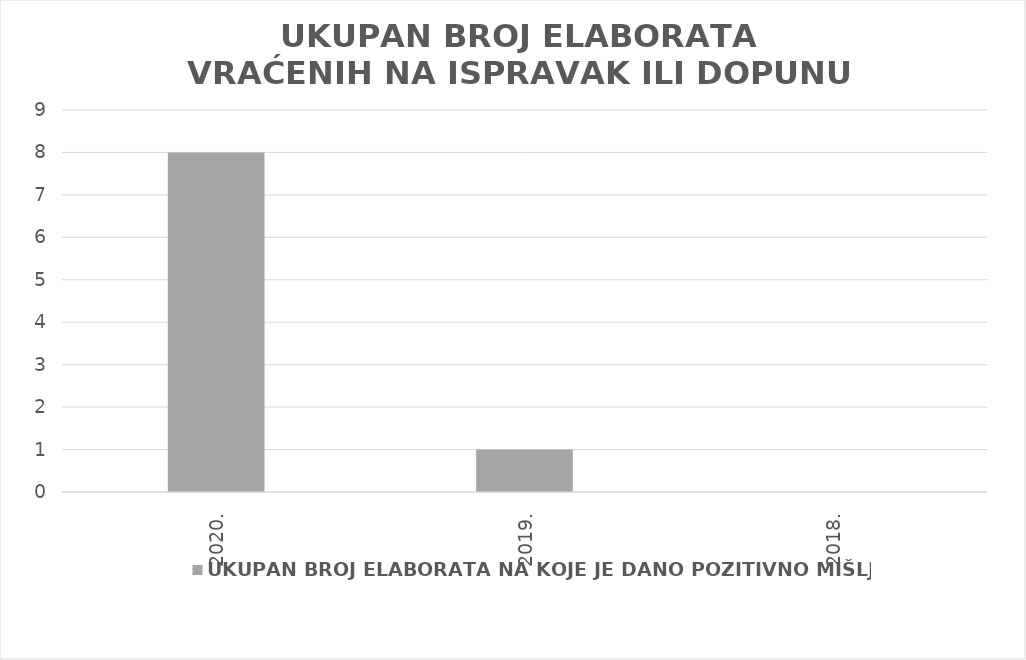
| Category | UKUPAN BROJ ELABORATA NA KOJE JE DANO POZITIVNO MIŠLJENJE |
|---|---|
| 2020. | 8 |
| 2019. | 1 |
| 2018. | 0 |